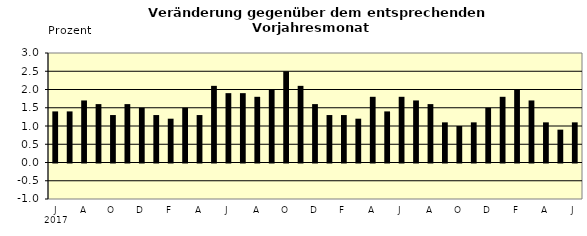
| Category | Series 0 |
|---|---|
| 0 | 1.4 |
| 1 | 1.4 |
| 2 | 1.7 |
| 3 | 1.6 |
| 4 | 1.3 |
| 5 | 1.6 |
| 6 | 1.5 |
| 7 | 1.3 |
| 8 | 1.2 |
| 9 | 1.5 |
| 10 | 1.3 |
| 11 | 2.1 |
| 12 | 1.9 |
| 13 | 1.9 |
| 14 | 1.8 |
| 15 | 2 |
| 16 | 2.5 |
| 17 | 2.1 |
| 18 | 1.6 |
| 19 | 1.3 |
| 20 | 1.3 |
| 21 | 1.2 |
| 22 | 1.8 |
| 23 | 1.4 |
| 24 | 1.8 |
| 25 | 1.7 |
| 26 | 1.6 |
| 27 | 1.1 |
| 28 | 1 |
| 29 | 1.1 |
| 30 | 1.5 |
| 31 | 1.8 |
| 32 | 2 |
| 33 | 1.7 |
| 34 | 1.1 |
| 35 | 0.9 |
| 36 | 1.1 |